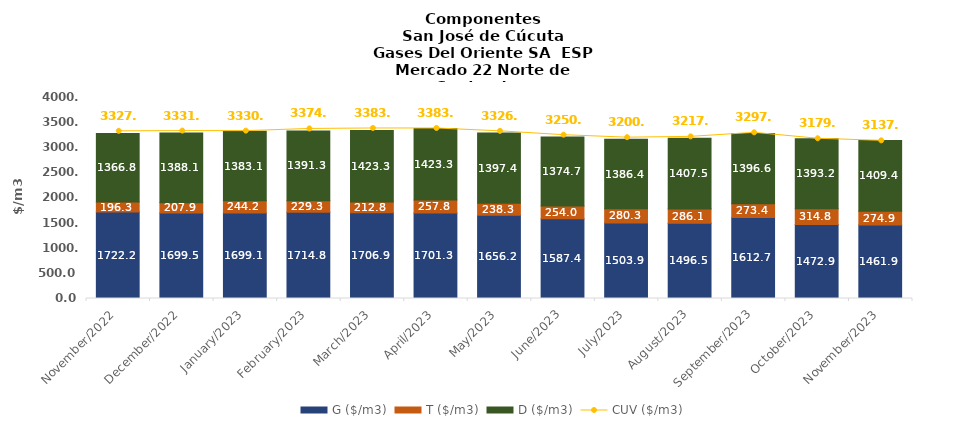
| Category | G ($/m3) | T ($/m3) | D ($/m3) |
|---|---|---|---|
| 2022-11-01 | 1722.18 | 196.33 | 1366.84 |
| 2022-12-01 | 1699.54 | 207.91 | 1388.06 |
| 2023-01-01 | 1699.06 | 244.23 | 1383.12 |
| 2023-02-01 | 1714.78 | 229.32 | 1391.26 |
| 2023-03-01 | 1706.94 | 212.77 | 1423.33 |
| 2023-04-01 | 1701.33 | 257.81 | 1423.3 |
| 2023-05-01 | 1656.2 | 238.29 | 1397.37 |
| 2023-06-01 | 1587.41 | 254 | 1374.66 |
| 2023-07-01 | 1503.89 | 280.27 | 1386.35 |
| 2023-08-01 | 1496.47 | 286.1 | 1407.49 |
| 2023-09-01 | 1612.68 | 273.44 | 1396.57 |
| 2023-10-01 | 1472.87 | 314.83 | 1393.18 |
| 2023-11-01 | 1461.93 | 274.94 | 1409.38 |